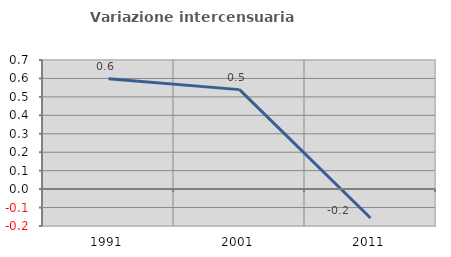
| Category | Variazione intercensuaria annua |
|---|---|
| 1991.0 | 0.598 |
| 2001.0 | 0.539 |
| 2011.0 | -0.157 |